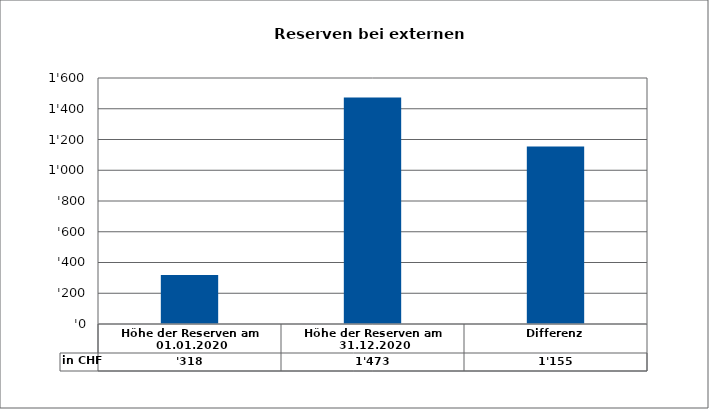
| Category | in CHF |
|---|---|
| Höhe der Reserven am 01.01.2020 | 318.29 |
| Höhe der Reserven am 31.12.2020 | 1473.1 |
| Differenz | 1154.81 |